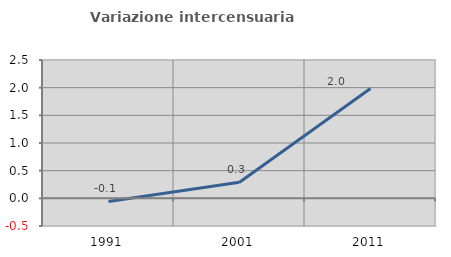
| Category | Variazione intercensuaria annua |
|---|---|
| 1991.0 | -0.056 |
| 2001.0 | 0.291 |
| 2011.0 | 1.986 |